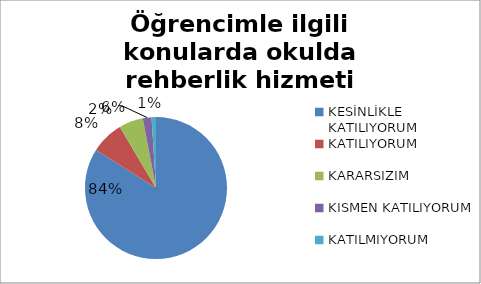
| Category | Öğrencimle ilgili konularda okulda rehberlik hizmeti alabiliyorum. |
|---|---|
| KESİNLİKLE KATILIYORUM | 168 |
| KATILIYORUM | 15 |
| KARARSIZIM | 11 |
| KISMEN KATILIYORUM | 4 |
| KATILMIYORUM | 2 |